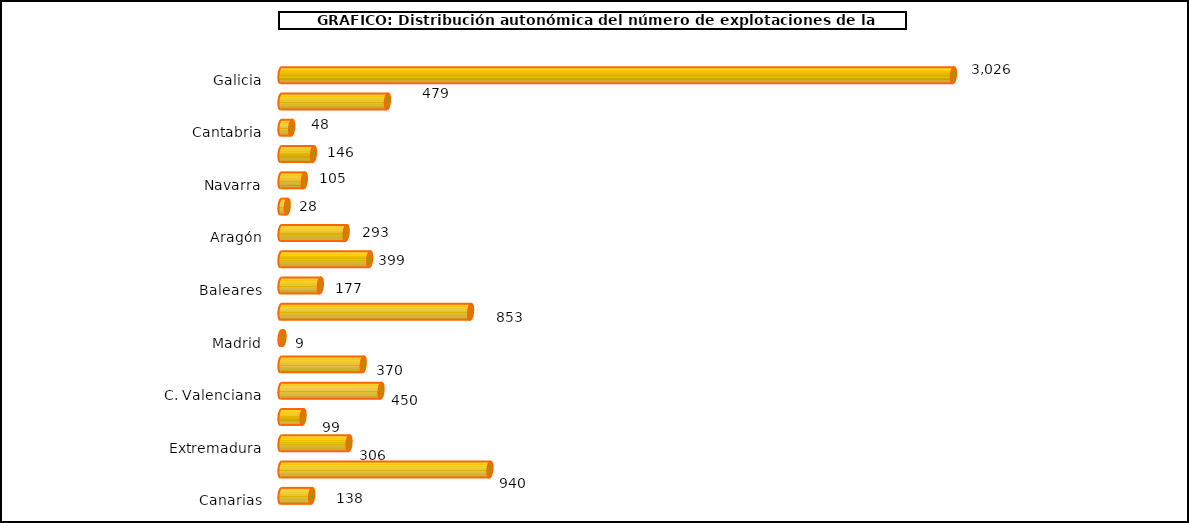
| Category | num. Explotaciones |
|---|---|
| 0 | 3026 |
| 1 | 479 |
| 2 | 48 |
| 3 | 146 |
| 4 | 105 |
| 5 | 28 |
| 6 | 293 |
| 7 | 399 |
| 8 | 177 |
| 9 | 853 |
| 10 | 9 |
| 11 | 370 |
| 12 | 450 |
| 13 | 99 |
| 14 | 306 |
| 15 | 940 |
| 16 | 138 |